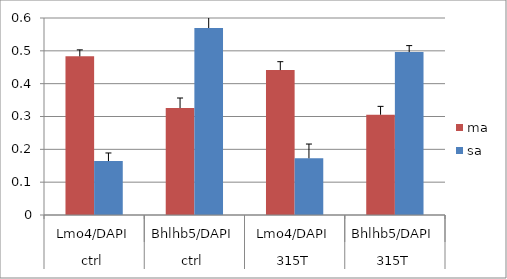
| Category | ma | sa |
|---|---|---|
| 0 | 0.483 | 0.164 |
| 1 | 0.326 | 0.569 |
| 2 | 0.441 | 0.173 |
| 3 | 0.305 | 0.496 |